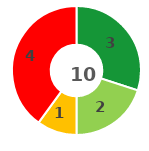
| Category | Series 0 |
|---|---|
| 0 | 3 |
| 1 | 2 |
| 2 | 1 |
| 3 | 4 |
| 4 | 0 |